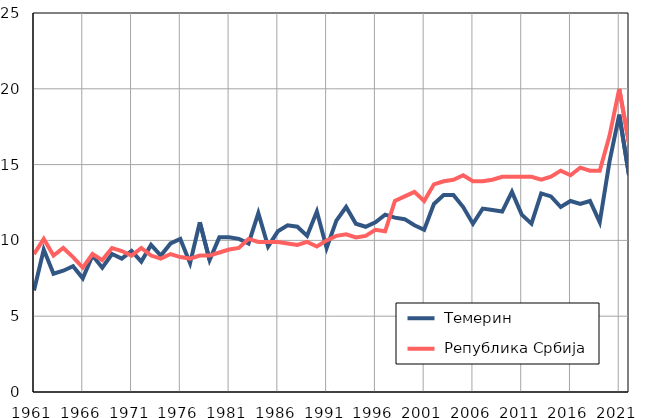
| Category |  Темерин |  Република Србија |
|---|---|---|
| 1961.0 | 6.7 | 9.1 |
| 1962.0 | 9.4 | 10.1 |
| 1963.0 | 7.8 | 9 |
| 1964.0 | 8 | 9.5 |
| 1965.0 | 8.3 | 8.9 |
| 1966.0 | 7.5 | 8.2 |
| 1967.0 | 9 | 9.1 |
| 1968.0 | 8.2 | 8.7 |
| 1969.0 | 9.1 | 9.5 |
| 1970.0 | 8.8 | 9.3 |
| 1971.0 | 9.3 | 9 |
| 1972.0 | 8.6 | 9.5 |
| 1973.0 | 9.7 | 9 |
| 1974.0 | 9 | 8.8 |
| 1975.0 | 9.8 | 9.1 |
| 1976.0 | 10.1 | 8.9 |
| 1977.0 | 8.5 | 8.8 |
| 1978.0 | 11.2 | 9 |
| 1979.0 | 8.7 | 9 |
| 1980.0 | 10.2 | 9.2 |
| 1981.0 | 10.2 | 9.4 |
| 1982.0 | 10.1 | 9.5 |
| 1983.0 | 9.8 | 10.1 |
| 1984.0 | 11.8 | 9.9 |
| 1985.0 | 9.6 | 9.9 |
| 1986.0 | 10.6 | 9.9 |
| 1987.0 | 11 | 9.8 |
| 1988.0 | 10.9 | 9.7 |
| 1989.0 | 10.3 | 9.9 |
| 1990.0 | 11.9 | 9.6 |
| 1991.0 | 9.5 | 10 |
| 1992.0 | 11.3 | 10.3 |
| 1993.0 | 12.2 | 10.4 |
| 1994.0 | 11.1 | 10.2 |
| 1995.0 | 10.9 | 10.3 |
| 1996.0 | 11.2 | 10.7 |
| 1997.0 | 11.7 | 10.6 |
| 1998.0 | 11.5 | 12.6 |
| 1999.0 | 11.4 | 12.9 |
| 2000.0 | 11 | 13.2 |
| 2001.0 | 10.7 | 12.6 |
| 2002.0 | 12.4 | 13.7 |
| 2003.0 | 13 | 13.9 |
| 2004.0 | 13 | 14 |
| 2005.0 | 12.2 | 14.3 |
| 2006.0 | 11.1 | 13.9 |
| 2007.0 | 12.1 | 13.9 |
| 2008.0 | 12 | 14 |
| 2009.0 | 11.9 | 14.2 |
| 2010.0 | 13.2 | 14.2 |
| 2011.0 | 11.7 | 14.2 |
| 2012.0 | 11.1 | 14.2 |
| 2013.0 | 13.1 | 14 |
| 2014.0 | 12.9 | 14.2 |
| 2015.0 | 12.2 | 14.6 |
| 2016.0 | 12.6 | 14.3 |
| 2017.0 | 12.4 | 14.8 |
| 2018.0 | 12.6 | 14.6 |
| 2019.0 | 11.2 | 14.6 |
| 2020.0 | 15.2 | 16.9 |
| 2021.0 | 18.3 | 20 |
| 2022.0 | 14.3 | 16.4 |